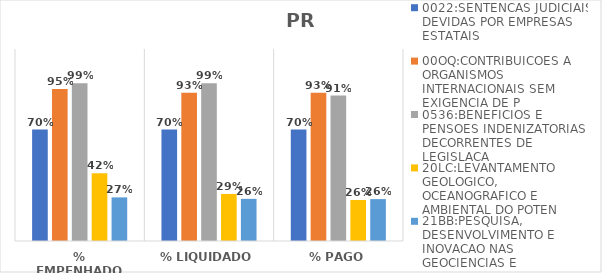
| Category | 0022:SENTENCAS JUDICIAIS DEVIDAS POR EMPRESAS ESTATAIS | 00OQ:CONTRIBUICOES A ORGANISMOS INTERNACIONAIS SEM EXIGENCIA DE P | 0536:BENEFICIOS E PENSOES INDENIZATORIAS DECORRENTES DE LEGISLACA | 20LC:LEVANTAMENTO GEOLOGICO, OCEANOGRAFICO E AMBIENTAL DO POTEN | 21BB:PESQUISA, DESENVOLVIMENTO E INOVACAO NAS GEOCIENCIAS E |
|---|---|---|---|---|---|
| % EMPENHADO | 0.697 | 0.95 | 0.985 | 0.423 | 0.273 |
| % LIQUIDADO | 0.697 | 0.926 | 0.985 | 0.294 | 0.263 |
| % PAGO | 0.697 | 0.926 | 0.909 | 0.256 | 0.262 |